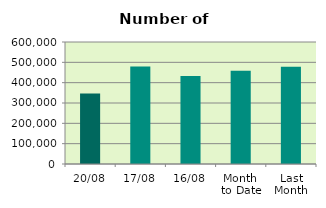
| Category | Series 0 |
|---|---|
| 20/08 | 346882 |
| 17/08 | 479436 |
| 16/08 | 432476 |
| Month 
to Date | 458350.857 |
| Last
Month | 477777.545 |